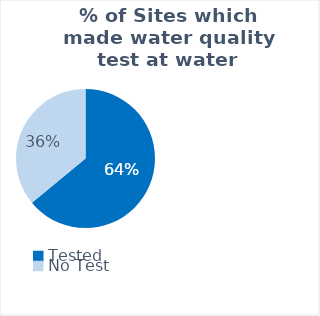
| Category | Central Rakhine |
|---|---|
| Tested | 16 |
| No Test | 9 |